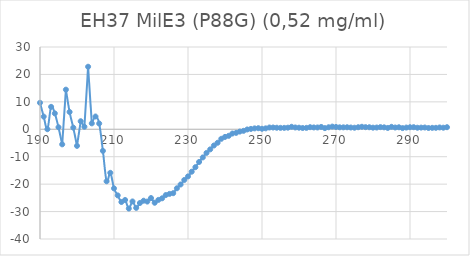
| Category | Series 0 |
|---|---|
| 300.0 | 0.755 |
| 299.0 | 0.577 |
| 298.0 | 0.671 |
| 297.0 | 0.537 |
| 296.0 | 0.526 |
| 295.0 | 0.47 |
| 294.0 | 0.645 |
| 293.0 | 0.61 |
| 292.0 | 0.568 |
| 291.0 | 0.757 |
| 290.0 | 0.743 |
| 289.0 | 0.626 |
| 288.0 | 0.439 |
| 287.0 | 0.731 |
| 286.0 | 0.646 |
| 285.0 | 0.893 |
| 284.0 | 0.493 |
| 283.0 | 0.71 |
| 282.0 | 0.786 |
| 281.0 | 0.641 |
| 280.0 | 0.594 |
| 279.0 | 0.744 |
| 278.0 | 0.776 |
| 277.0 | 0.911 |
| 276.0 | 0.754 |
| 275.0 | 0.572 |
| 274.0 | 0.645 |
| 273.0 | 0.735 |
| 272.0 | 0.709 |
| 271.0 | 0.716 |
| 270.0 | 0.839 |
| 269.0 | 0.976 |
| 268.0 | 0.736 |
| 267.0 | 0.427 |
| 266.0 | 0.855 |
| 265.0 | 0.664 |
| 264.0 | 0.67 |
| 263.0 | 0.761 |
| 262.0 | 0.52 |
| 261.0 | 0.466 |
| 260.0 | 0.58 |
| 259.0 | 0.658 |
| 258.0 | 0.91 |
| 257.0 | 0.585 |
| 256.0 | 0.518 |
| 255.0 | 0.522 |
| 254.0 | 0.564 |
| 253.0 | 0.645 |
| 252.0 | 0.649 |
| 251.0 | 0.337 |
| 250.0 | 0.191 |
| 249.0 | 0.395 |
| 248.0 | 0.329 |
| 247.0 | 0.138 |
| 246.0 | -0.07 |
| 245.0 | -0.567 |
| 244.0 | -0.829 |
| 243.0 | -1.305 |
| 242.0 | -1.544 |
| 241.0 | -2.387 |
| 240.0 | -2.783 |
| 239.0 | -3.471 |
| 238.0 | -4.91 |
| 237.0 | -5.919 |
| 236.0 | -7.323 |
| 235.0 | -8.615 |
| 234.0 | -10.26 |
| 233.0 | -11.917 |
| 232.0 | -13.819 |
| 231.0 | -15.465 |
| 230.0 | -17.179 |
| 229.0 | -18.469 |
| 228.0 | -20.13 |
| 227.0 | -21.509 |
| 226.0 | -23.298 |
| 225.0 | -23.555 |
| 224.0 | -23.978 |
| 223.0 | -25.164 |
| 222.0 | -25.747 |
| 221.0 | -26.786 |
| 220.0 | -25.078 |
| 219.0 | -26.349 |
| 218.0 | -26.044 |
| 217.0 | -26.88 |
| 216.0 | -28.652 |
| 215.0 | -26.316 |
| 214.0 | -28.898 |
| 213.0 | -25.779 |
| 212.0 | -26.513 |
| 211.0 | -24.103 |
| 210.0 | -21.54 |
| 209.0 | -15.88 |
| 208.0 | -18.958 |
| 207.0 | -7.872 |
| 206.0 | 2.1 |
| 205.0 | 4.659 |
| 204.0 | 2.158 |
| 203.0 | 22.803 |
| 202.0 | 0.918 |
| 201.0 | 2.935 |
| 200.0 | -6.05 |
| 199.0 | 0.595 |
| 198.0 | 6.31 |
| 197.0 | 14.448 |
| 196.0 | -5.488 |
| 195.0 | 0.74 |
| 194.0 | 5.81 |
| 193.0 | 8.183 |
| 192.0 | 0.028 |
| 191.0 | 4.626 |
| 190.0 | 9.662 |